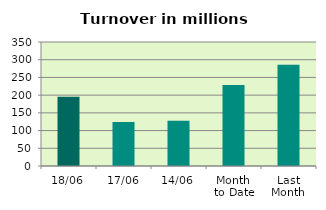
| Category | Series 0 |
|---|---|
| 18/06 | 195.362 |
| 17/06 | 124.179 |
| 14/06 | 127.43 |
| Month 
to Date | 228.349 |
| Last
Month | 285.992 |